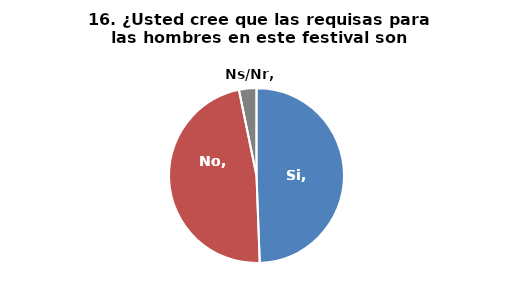
| Category | Series 0 |
|---|---|
| Si | 0.494 |
| No | 0.474 |
| Ns/Nr | 0.032 |